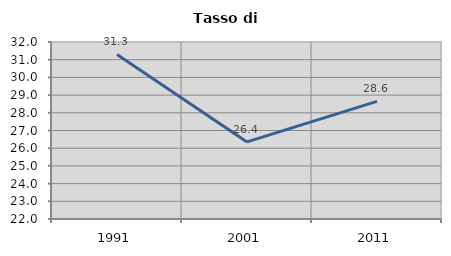
| Category | Tasso di disoccupazione   |
|---|---|
| 1991.0 | 31.294 |
| 2001.0 | 26.354 |
| 2011.0 | 28.647 |